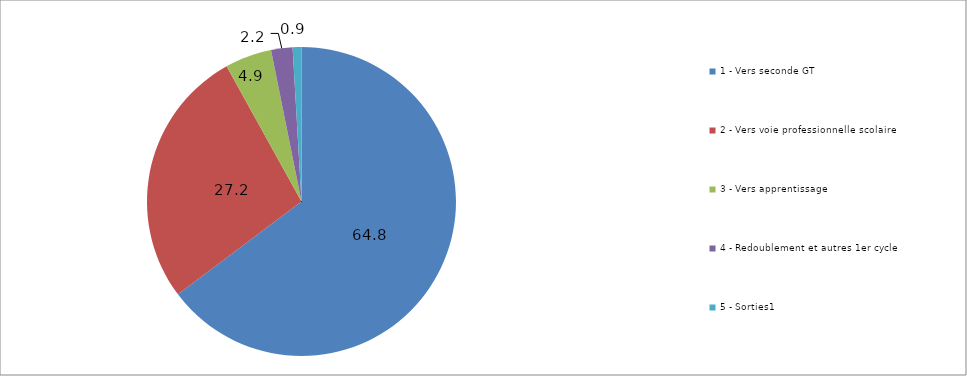
| Category | 1 - Vers seconde GT 2 - Vers voie professionnelle scolaire 3 - Vers apprentissage 4 - Redoublement et autres 1er cycle 5 - Sorties1 |
|---|---|
| 1 - Vers seconde GT | 64.756 |
| 2 - Vers voie professionnelle scolaire | 27.188 |
| 3 - Vers apprentissage | 4.894 |
| 4 - Redoublement et autres 1er cycle | 2.243 |
| 5 - Sorties1 | 0.918 |